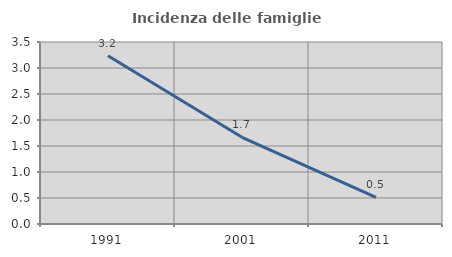
| Category | Incidenza delle famiglie numerose |
|---|---|
| 1991.0 | 3.236 |
| 2001.0 | 1.667 |
| 2011.0 | 0.514 |